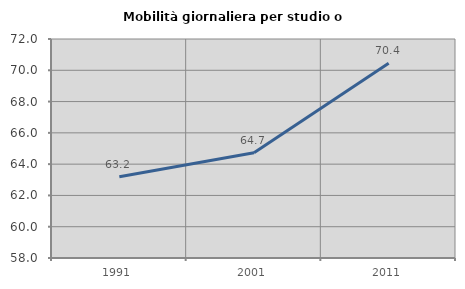
| Category | Mobilità giornaliera per studio o lavoro |
|---|---|
| 1991.0 | 63.191 |
| 2001.0 | 64.727 |
| 2011.0 | 70.445 |